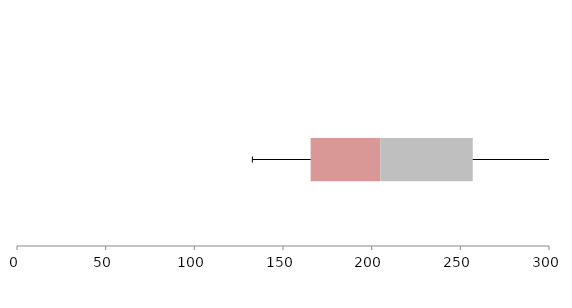
| Category | Series 1 | Series 2 | Series 3 |
|---|---|---|---|
| 0 | 165.594 | 39.238 | 52.179 |